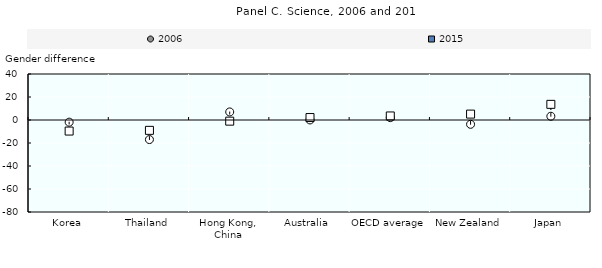
| Category | 2006 | 2015 |
|---|---|---|
| Korea | -1.864 | -9.618 |
| Thailand | -17 | -9 |
| Hong Kong, China | 7 | -1 |
| Australia | 0.048 | 2.128 |
| OECD average | 2.056 | 3.518 |
| New Zealand | -3.747 | 5.125 |
| Japan | 3.257 | 13.609 |